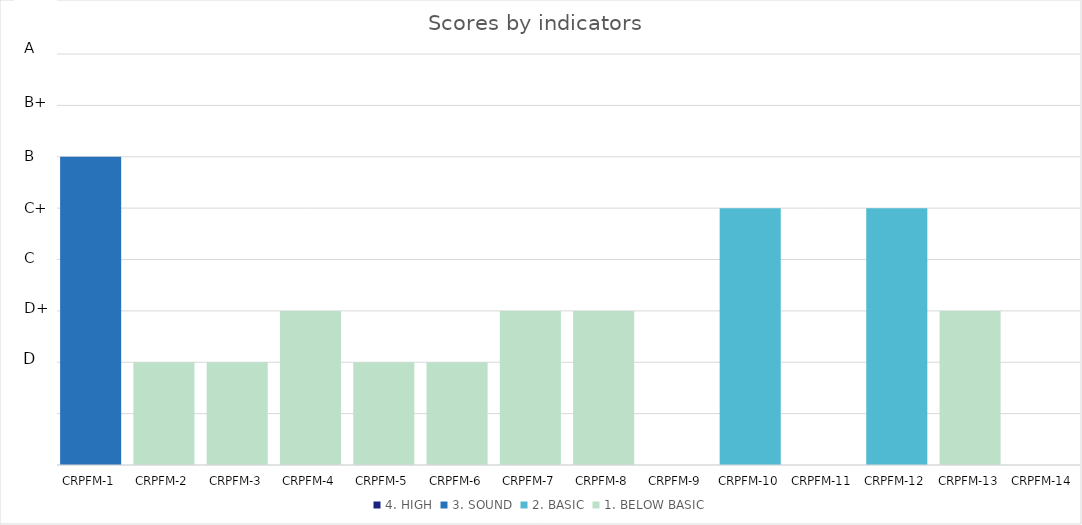
| Category | 4. HIGH | 3. SOUND | 2. BASIC | 1. BELOW BASIC |
|---|---|---|---|---|
| CRPFM-1 | 0 | 3 | 0 | 0 |
| CRPFM-2 | 0 | 0 | 0 | 1 |
| CRPFM-3 | 0 | 0 | 0 | 1 |
| CRPFM-4 | 0 | 0 | 0 | 1.5 |
| CRPFM-5 | 0 | 0 | 0 | 1 |
| CRPFM-6 | 0 | 0 | 0 | 1 |
| CRPFM-7 | 0 | 0 | 0 | 1.5 |
| CRPFM-8 | 0 | 0 | 0 | 1.5 |
| CRPFM-9 | 0 | 0 | 0 | 0 |
| CRPFM-10 | 0 | 0 | 2.5 | 0 |
| CRPFM-11 | 0 | 0 | 0 | 0 |
| CRPFM-12 | 0 | 0 | 2.5 | 0 |
| CRPFM-13 | 0 | 0 | 0 | 1.5 |
| CRPFM-14 | 0 | 0 | 0 | 0 |